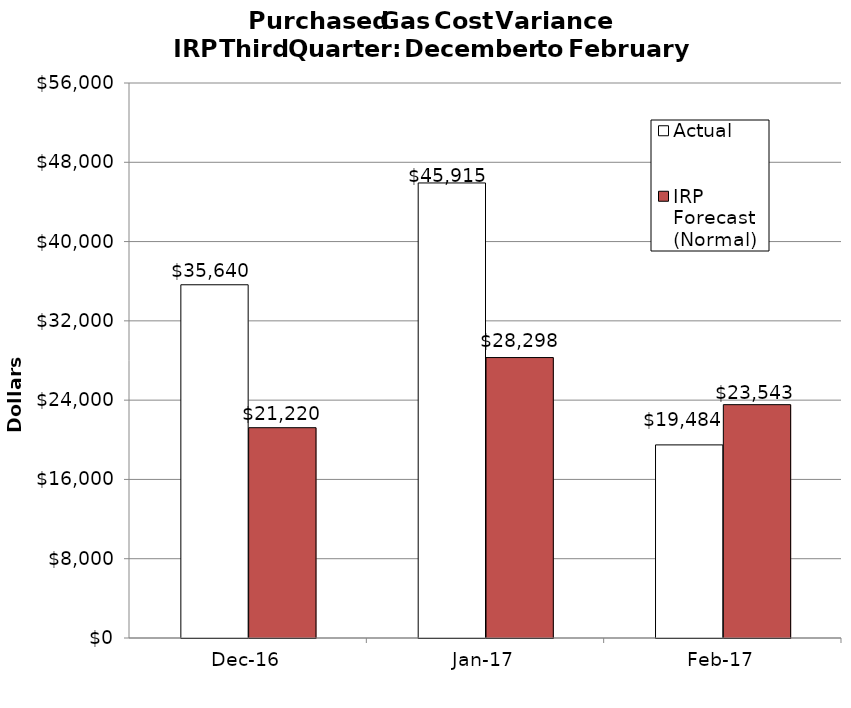
| Category | Actual | IRP Forecast (Normal) |
|---|---|---|
| 2016-12-01 | 35640.104 | 21219.87 |
| 2017-01-01 | 45914.593 | 28297.5 |
| 2017-02-01 | 19483.684 | 23543.13 |